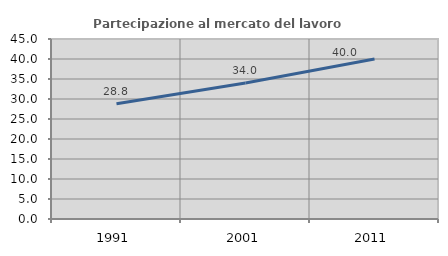
| Category | Partecipazione al mercato del lavoro  femminile |
|---|---|
| 1991.0 | 28.792 |
| 2001.0 | 34.025 |
| 2011.0 | 40 |